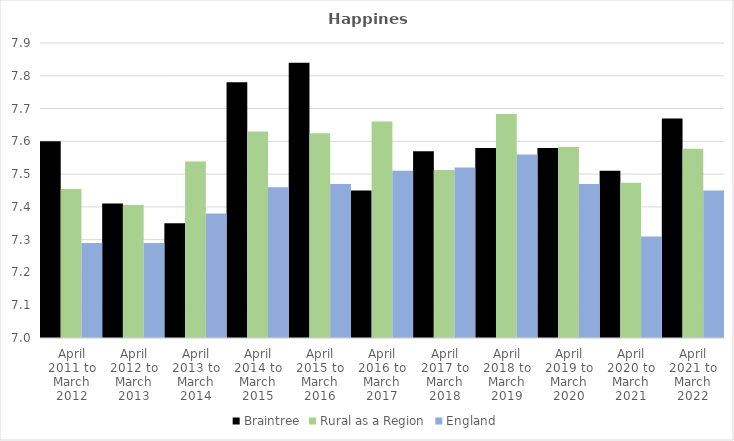
| Category | Braintree | Rural as a Region | England |
|---|---|---|---|
| April 2011 to March 2012 | 7.6 | 7.454 | 7.29 |
| April 2012 to March 2013 | 7.41 | 7.406 | 7.29 |
| April 2013 to March 2014 | 7.35 | 7.539 | 7.38 |
| April 2014 to March 2015 | 7.78 | 7.63 | 7.46 |
| April 2015 to March 2016 | 7.84 | 7.625 | 7.47 |
| April 2016 to March 2017 | 7.45 | 7.661 | 7.51 |
| April 2017 to March 2018 | 7.57 | 7.513 | 7.52 |
| April 2018 to March 2019 | 7.58 | 7.684 | 7.56 |
| April 2019 to March 2020 | 7.58 | 7.582 | 7.47 |
| April 2020 to March 2021 | 7.51 | 7.474 | 7.31 |
| April 2021 to March 2022 | 7.67 | 7.577 | 7.45 |